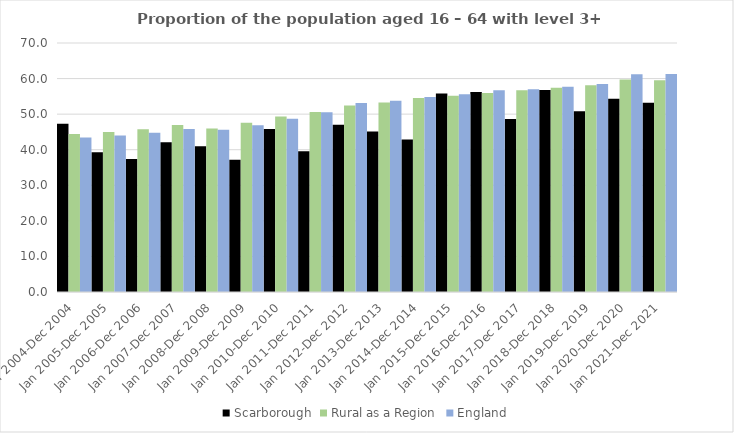
| Category | Scarborough | Rural as a Region | England |
|---|---|---|---|
| Jan 2004-Dec 2004 | 47.3 | 44.405 | 43.4 |
| Jan 2005-Dec 2005 | 39.3 | 44.973 | 44 |
| Jan 2006-Dec 2006 | 37.4 | 45.774 | 44.8 |
| Jan 2007-Dec 2007 | 42.1 | 46.968 | 45.8 |
| Jan 2008-Dec 2008 | 41 | 45.964 | 45.6 |
| Jan 2009-Dec 2009 | 37.2 | 47.59 | 46.9 |
| Jan 2010-Dec 2010 | 45.8 | 49.362 | 48.7 |
| Jan 2011-Dec 2011 | 39.6 | 50.602 | 50.5 |
| Jan 2012-Dec 2012 | 47 | 52.439 | 53.1 |
| Jan 2013-Dec 2013 | 45.1 | 53.276 | 53.8 |
| Jan 2014-Dec 2014 | 42.9 | 54.57 | 54.8 |
| Jan 2015-Dec 2015 | 55.8 | 55.16 | 55.6 |
| Jan 2016-Dec 2016 | 56.2 | 55.941 | 56.7 |
| Jan 2017-Dec 2017 | 48.6 | 56.689 | 57 |
| Jan 2018-Dec 2018 | 56.8 | 57.389 | 57.7 |
| Jan 2019-Dec 2019 | 50.8 | 58.147 | 58.5 |
| Jan 2020-Dec 2020 | 54.3 | 59.771 | 61.2 |
| Jan 2021-Dec 2021 | 53.2 | 59.54 | 61.3 |